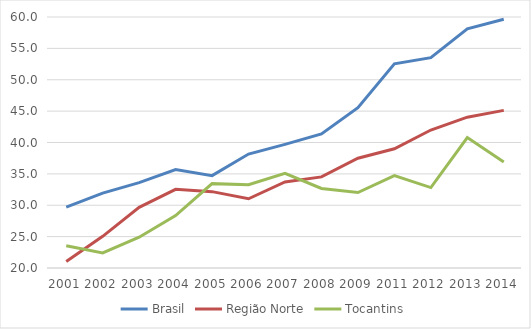
| Category | Brasil | Região Norte | Tocantins |
|---|---|---|---|
| 2001.0 | 29.688 | 21.054 | 23.55 |
| 2002.0 | 31.93 | 25.043 | 22.391 |
| 2003.0 | 33.607 | 29.661 | 24.909 |
| 2004.0 | 35.677 | 32.53 | 28.351 |
| 2005.0 | 34.718 | 32.17 | 33.446 |
| 2006.0 | 38.163 | 31.034 | 33.281 |
| 2007.0 | 39.695 | 33.709 | 35.084 |
| 2008.0 | 41.365 | 34.518 | 32.669 |
| 2009.0 | 45.537 | 37.501 | 32.029 |
| 2011.0 | 52.531 | 39.009 | 34.713 |
| 2012.0 | 53.525 | 41.987 | 32.817 |
| 2013.0 | 58.121 | 44.035 | 40.794 |
| 2014.0 | 59.64 | 45.121 | 36.898 |